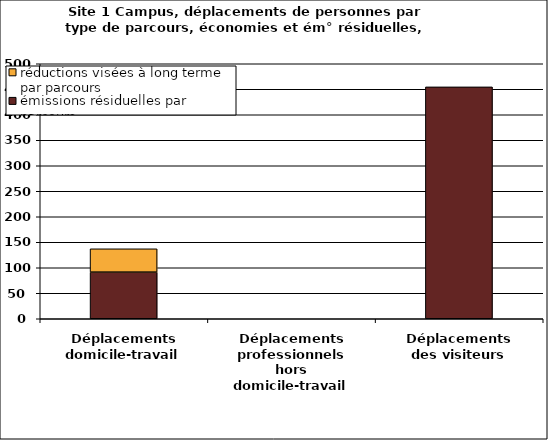
| Category | émissions résiduelles par parcours | réductions visées à long terme par parcours |
|---|---|---|
| Déplacements domicile-travail | 91.44 | 45.731 |
| Déplacements professionnels hors domicile-travail | 0 | 0 |
| Déplacements des visiteurs | 454.682 | 0 |